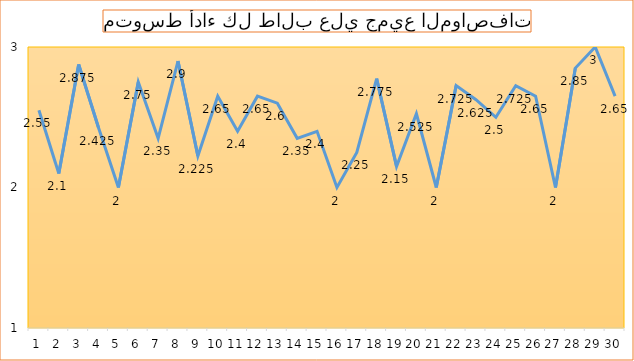
| Category | Series 0 |
|---|---|
| 0 | 2.55 |
| 1 | 2.1 |
| 2 | 2.875 |
| 3 | 2.425 |
| 4 | 2 |
| 5 | 2.75 |
| 6 | 2.35 |
| 7 | 2.9 |
| 8 | 2.225 |
| 9 | 2.65 |
| 10 | 2.4 |
| 11 | 2.65 |
| 12 | 2.6 |
| 13 | 2.35 |
| 14 | 2.4 |
| 15 | 2 |
| 16 | 2.25 |
| 17 | 2.775 |
| 18 | 2.15 |
| 19 | 2.525 |
| 20 | 2 |
| 21 | 2.725 |
| 22 | 2.625 |
| 23 | 2.5 |
| 24 | 2.725 |
| 25 | 2.65 |
| 26 | 2 |
| 27 | 2.85 |
| 28 | 3 |
| 29 | 2.65 |